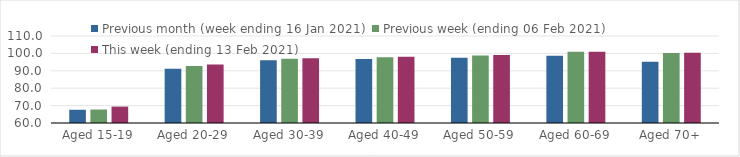
| Category | Previous month (week ending 16 Jan 2021) | Previous week (ending 06 Feb 2021) | This week (ending 13 Feb 2021) |
|---|---|---|---|
| Aged 15-19 | 67.61 | 67.74 | 69.43 |
| Aged 20-29 | 91.16 | 92.7 | 93.6 |
| Aged 30-39 | 96.04 | 96.94 | 97.21 |
| Aged 40-49 | 96.74 | 97.84 | 98.11 |
| Aged 50-59 | 97.49 | 98.84 | 99.03 |
| Aged 60-69 | 98.59 | 100.98 | 101 |
| Aged 70+ | 95.22 | 100.16 | 100.42 |